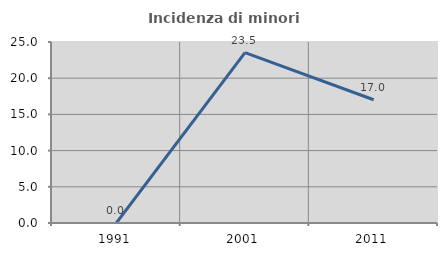
| Category | Incidenza di minori stranieri |
|---|---|
| 1991.0 | 0 |
| 2001.0 | 23.529 |
| 2011.0 | 17.021 |